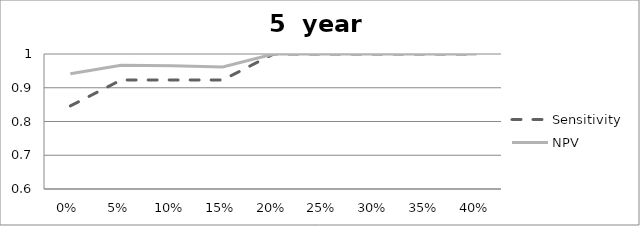
| Category | Sensitivity | NPV |
|---|---|---|
| 0.0 | 0.846 | 0.941 |
| 0.05 | 0.923 | 0.967 |
| 0.1 | 0.923 | 0.966 |
| 0.15 | 0.923 | 0.962 |
| 0.2 | 1 | 1 |
| 0.25 | 1 | 1 |
| 0.3 | 1 | 1 |
| 0.35 | 1 | 1 |
| 0.4 | 1 | 1 |